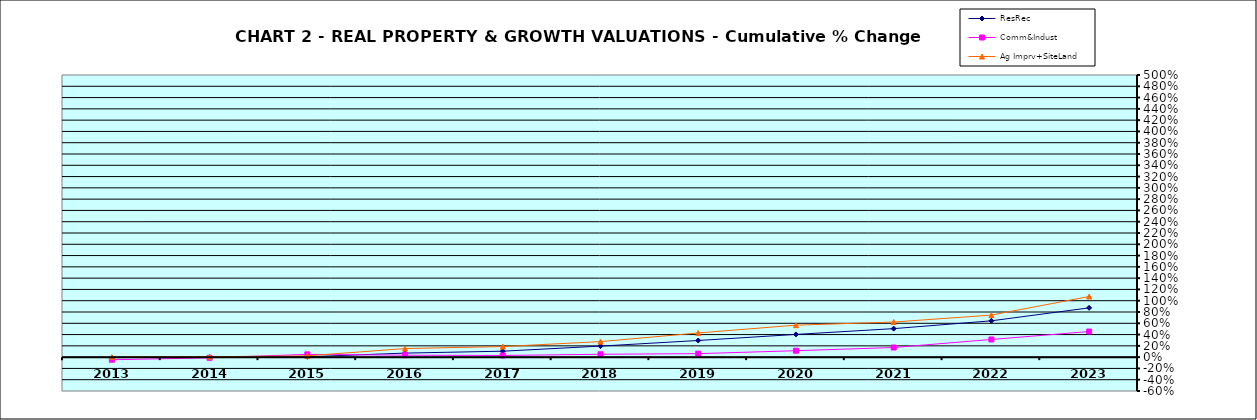
| Category | ResRec | Comm&Indust | Ag Imprv+SiteLand |
|---|---|---|---|
| 2013.0 | -0.008 | -0.046 | 0 |
| 2014.0 | -0.001 | -0.012 | 0.008 |
| 2015.0 | 0.006 | 0.049 | 0.023 |
| 2016.0 | 0.072 | 0.035 | 0.152 |
| 2017.0 | 0.106 | 0.03 | 0.188 |
| 2018.0 | 0.196 | 0.051 | 0.275 |
| 2019.0 | 0.295 | 0.062 | 0.429 |
| 2020.0 | 0.403 | 0.114 | 0.567 |
| 2021.0 | 0.505 | 0.171 | 0.622 |
| 2022.0 | 0.644 | 0.313 | 0.745 |
| 2023.0 | 0.874 | 0.454 | 1.075 |